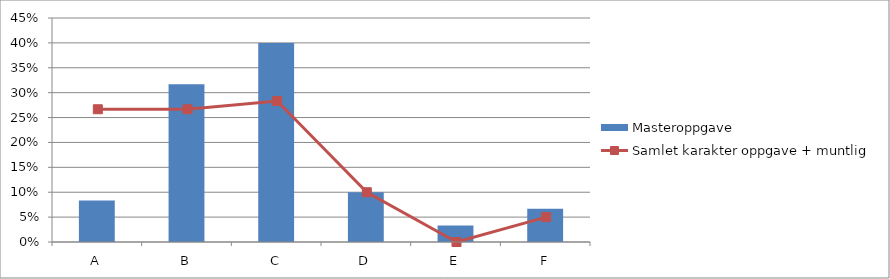
| Category | Masteroppgave |
|---|---|
| A | 0.083 |
| B | 0.317 |
| C | 0.4 |
| D | 0.1 |
| E | 0.033 |
| F | 0.067 |